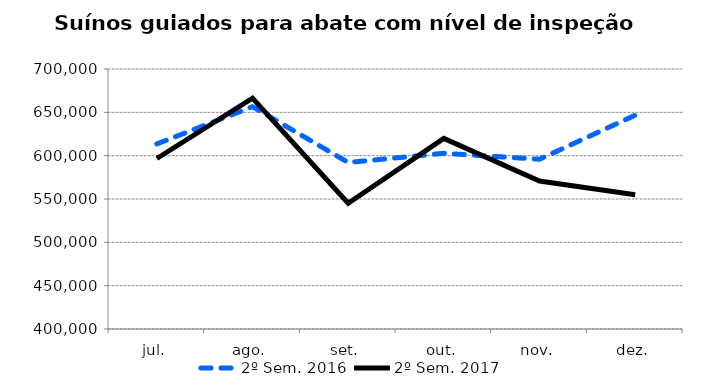
| Category | 2º Sem. 2016 | 2º Sem. 2017 |
|---|---|---|
| jul. | 613559 | 596736 |
| ago. | 656481 | 666395 |
| set. | 592140 | 545119 |
| out. | 602733 | 619868 |
| nov. | 595900 | 570746 |
| dez. | 646672 | 554942 |